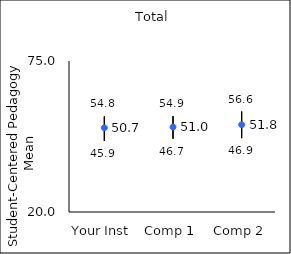
| Category | 25th percentile | 75th percentile | Mean |
|---|---|---|---|
| Your Inst | 45.9 | 54.8 | 50.67 |
| Comp 1 | 46.7 | 54.9 | 50.98 |
| Comp 2 | 46.9 | 56.6 | 51.79 |